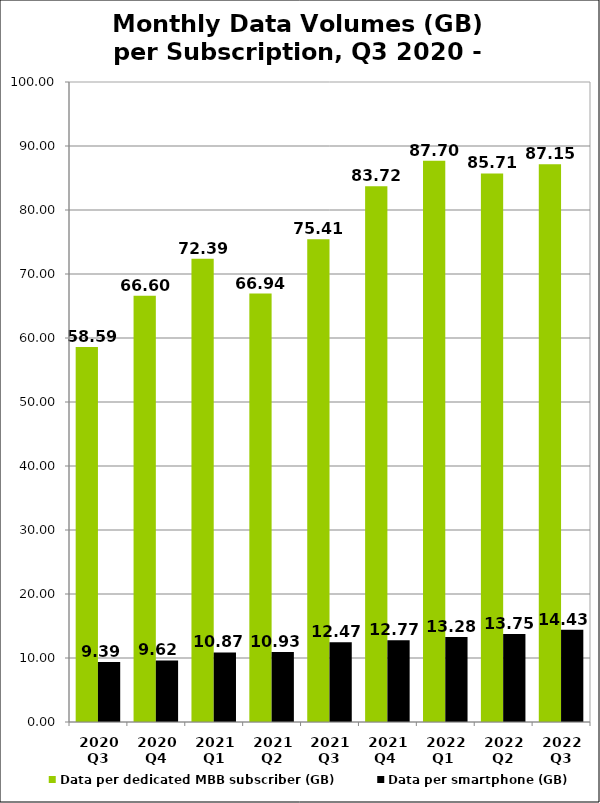
| Category | Data per dedicated MBB subscriber (GB) | Data per smartphone (GB) |
|---|---|---|
| 2020 Q3 | 58.589 | 9.387 |
| 2020 Q4 | 66.6 | 9.617 |
| 2021 Q1 | 72.393 | 10.869 |
| 2021 Q2 | 66.937 | 10.929 |
| 2021 Q3 | 75.414 | 12.47 |
| 2021 Q4  | 83.723 | 12.771 |
| 2022 Q1  | 87.695 | 13.277 |
| 2022 Q2 | 85.711 | 13.751 |
| 2022 Q3 | 87.155 | 14.433 |